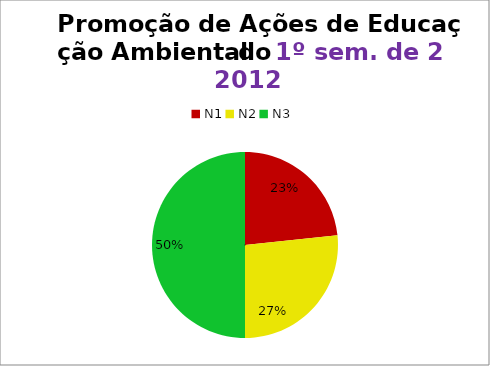
| Category | 1º/12 |
|---|---|
| N1 | 7 |
| N2 | 8 |
| N3 | 15 |